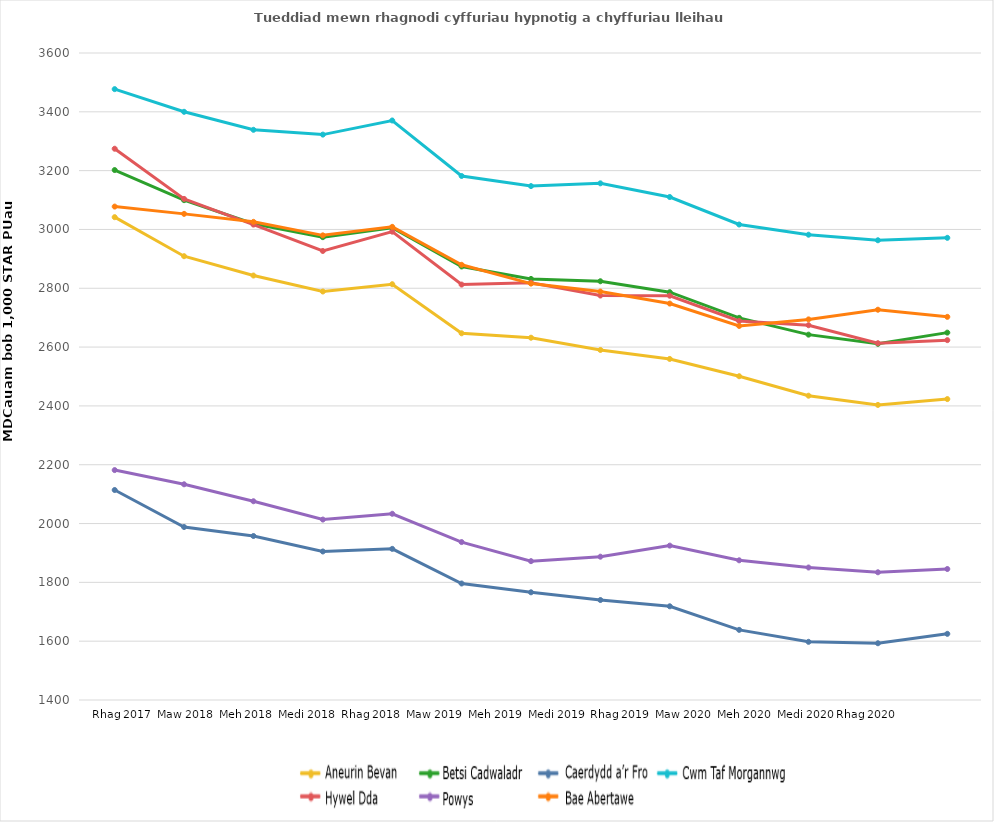
| Category | Aneurin Bevan | Betsi Cadwaladr | Cardiff And Vale | Cwm Taf Morgannwg | Hywel Dda | Powys | Swansea Bay |
|---|---|---|---|---|---|---|---|
| Dec 2017 | 3041.757 | 3202.012 | 2114.057 | 3477.155 | 3274.481 | 2181.761 | 3077.808 |
| Mar 2018 | 2909.046 | 3099.635 | 1988.199 | 3400.093 | 3103.872 | 2133.459 | 3052.997 |
| Jun 2018 | 2843.317 | 3019.291 | 1957.65 | 3338.864 | 3016.561 | 2075.804 | 3025.832 |
| Sep 2018 | 2789.01 | 2973.764 | 1905.007 | 3322.503 | 2926.809 | 2013.528 | 2979.933 |
| Dec 2018 | 2813.836 | 3005.678 | 1913.887 | 3370.521 | 2992.474 | 2033.211 | 3008.864 |
| Mar 2019 | 2646.908 | 2874.114 | 1796.17 | 3181.789 | 2812.61 | 1937.006 | 2879.821 |
| Jun 2019 | 2631.875 | 2831.813 | 1766.206 | 3147.466 | 2818.549 | 1872.119 | 2815.913 |
| Sep 2019 | 2590.262 | 2823.862 | 1739.967 | 3156.826 | 2775.312 | 1887.313 | 2788.806 |
| Dec 2019 | 2559.722 | 2786.726 | 1718.636 | 3110.353 | 2774.562 | 1924.952 | 2747.976 |
| Mar 2020 | 2500.908 | 2699.477 | 1638.489 | 3016.835 | 2688.714 | 1875.031 | 2671.922 |
| Jun 2020 | 2434.69 | 2642.312 | 1597.823 | 2982.128 | 2674.295 | 1850.507 | 2694.19 |
| Sep 2020 | 2403.363 | 2611.023 | 1592.957 | 2963.218 | 2613.192 | 1834.276 | 2727.07 |
| Dec 2020 | 2423.191 | 2649.187 | 1624.994 | 2971.519 | 2623.649 | 1845.408 | 2702.794 |